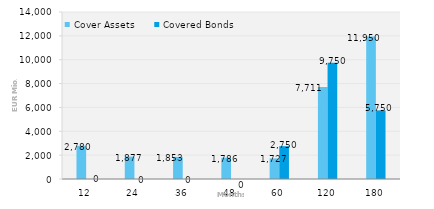
| Category | Cover Assets | Covered Bonds |
|---|---|---|
| 12.0 | 2780.445 | 0 |
| 24.0 | 1877.499 | 0 |
| 36.0 | 1852.934 | 0 |
| 48.0 | 1785.802 | 0 |
| 60.0 | 1726.663 | 2750 |
| 120.0 | 7711.25 | 9750 |
| 180.0 | 11949.714 | 5750 |